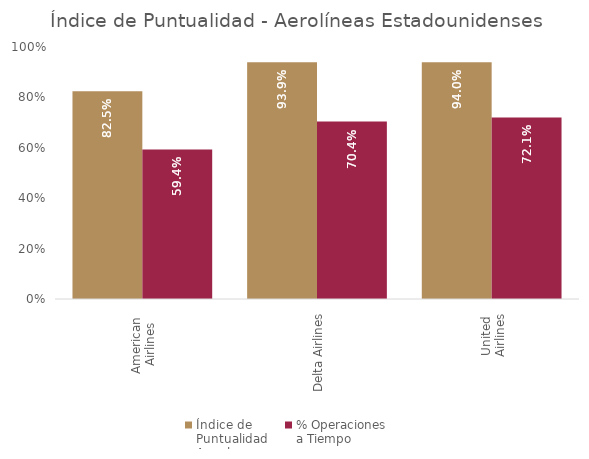
| Category | Índice de 
Puntualidad
Anual | % Operaciones 
a Tiempo |
|---|---|---|
| American 
Airlines | 0.825 | 0.594 |
| Delta Airlines | 0.939 | 0.704 |
| United 
Airlines | 0.94 | 0.721 |